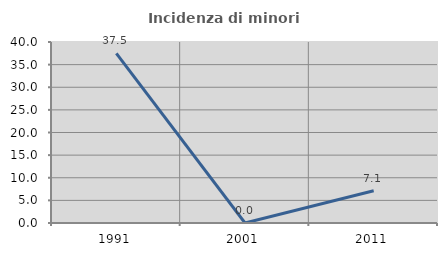
| Category | Incidenza di minori stranieri |
|---|---|
| 1991.0 | 37.5 |
| 2001.0 | 0 |
| 2011.0 | 7.143 |